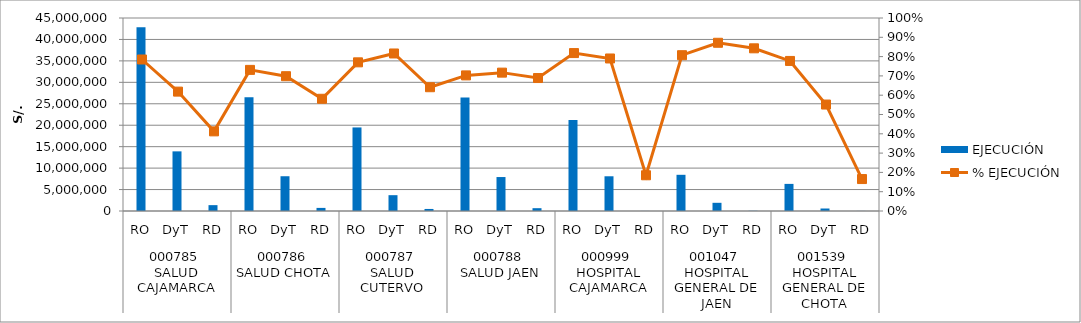
| Category | EJECUCIÓN |
|---|---|
| 0 | 42815781 |
| 1 | 13905031 |
| 2 | 1365687 |
| 3 | 26510344 |
| 4 | 8106486 |
| 5 | 721781 |
| 6 | 19481373 |
| 7 | 3688975 |
| 8 | 476597 |
| 9 | 26478067 |
| 10 | 7918282 |
| 11 | 656485 |
| 12 | 21222502 |
| 13 | 8096215 |
| 14 | 14898 |
| 15 | 8440001 |
| 16 | 1910841 |
| 17 | 44448 |
| 18 | 6320376 |
| 19 | 580799 |
| 20 | 16130 |